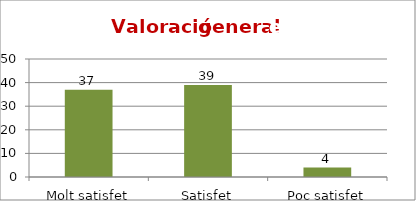
| Category | Series 0 |
|---|---|
| Molt satisfet | 37 |
| Satisfet | 39 |
| Poc satisfet | 4 |